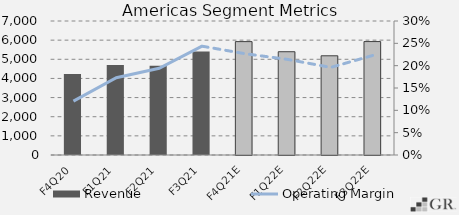
| Category | Revenue |
|---|---|
|  F4Q20  | 4232.9 |
|  F1Q21  | 4703.2 |
|  F2Q21  | 4664.6 |
|  F3Q21  | 5400.3 |
|  F4Q21E  | 5923.031 |
|  F1Q22E  | 5394.577 |
|  F2Q22E  | 5182.884 |
|  F3Q22E  | 5925.613 |